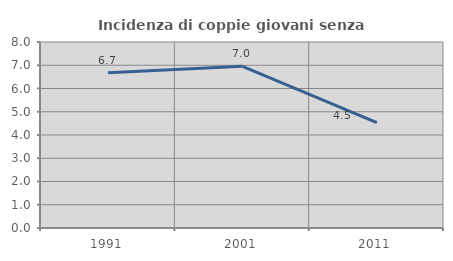
| Category | Incidenza di coppie giovani senza figli |
|---|---|
| 1991.0 | 6.673 |
| 2001.0 | 6.957 |
| 2011.0 | 4.536 |